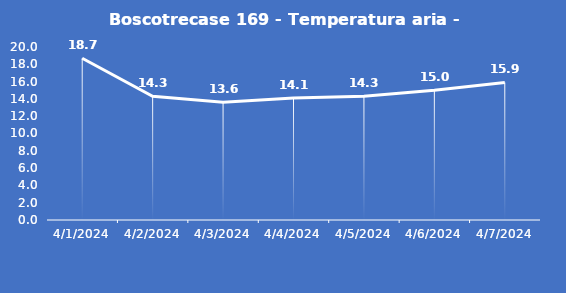
| Category | Boscotrecase 169 - Temperatura aria - Grezzo (°C) |
|---|---|
| 4/1/24 | 18.7 |
| 4/2/24 | 14.3 |
| 4/3/24 | 13.6 |
| 4/4/24 | 14.1 |
| 4/5/24 | 14.3 |
| 4/6/24 | 15 |
| 4/7/24 | 15.9 |